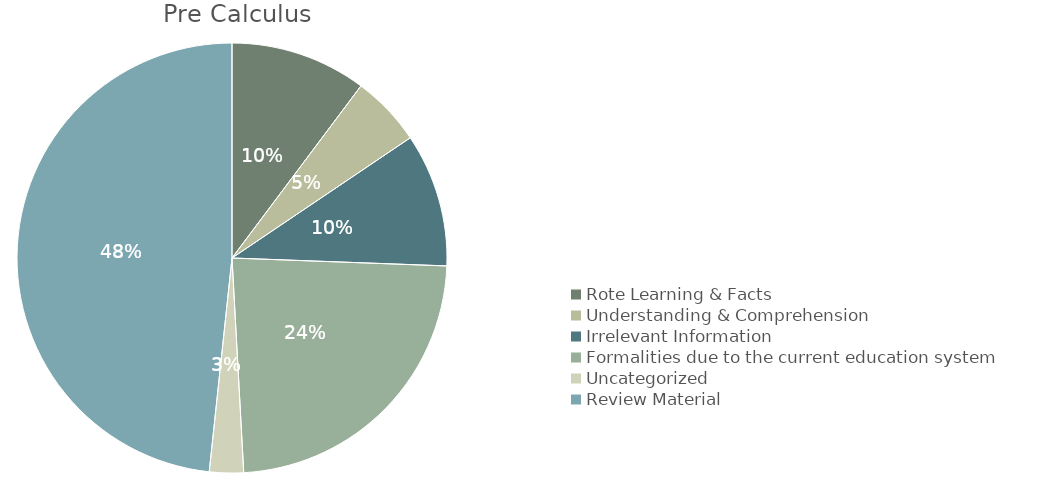
| Category | Pre Calculus  |
|---|---|
| Rote Learning & Facts | 5 |
| Understanding & Comprehension | 2.6 |
| Irrelevant Information  | 4.9 |
| Formalities due to the current education system | 11.5 |
| Uncategorized | 1.25 |
| Review Material | 23.6 |